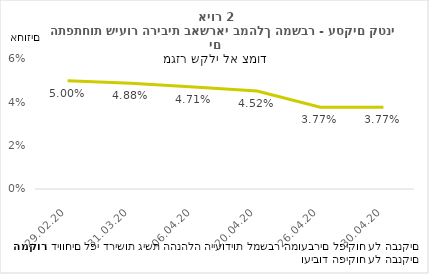
| Category | עסקים קטנים |
|---|---|
| 29.02.20 | 0.05 |
| 31.03.20 | 0.049 |
| 06.04.20 | 0.047 |
| 20.04.20 | 0.045 |
| 26.04.20 | 0.038 |
| 30.04.20 | 0.038 |